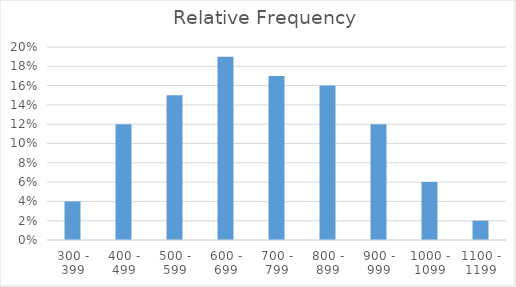
| Category | Relative Frequency |
|---|---|
| 300 - 399 | 0.04 |
| 400 - 499 | 0.12 |
| 500 - 599 | 0.15 |
| 600 - 699 | 0.19 |
| 700 - 799 | 0.17 |
| 800 - 899 | 0.16 |
| 900 - 999 | 0.12 |
| 1000 - 1099 | 0.06 |
| 1100 - 1199 | 0.02 |